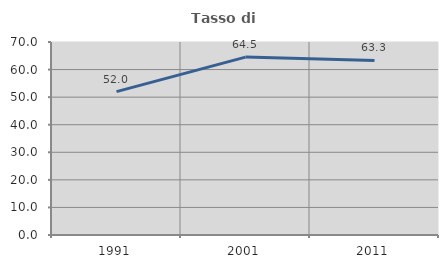
| Category | Tasso di occupazione   |
|---|---|
| 1991.0 | 52 |
| 2001.0 | 64.516 |
| 2011.0 | 63.333 |